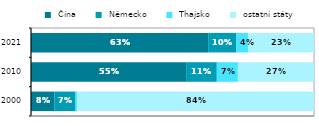
| Category |  Čína |  Německo |  Thajsko |  ostatní státy |
|---|---|---|---|---|
| 2000 | 0.082 | 0.073 | 0.008 | 0.836 |
| 2010 | 0.548 | 0.108 | 0.075 | 0.269 |
| 2021 | 0.626 | 0.1 | 0.042 | 0.232 |